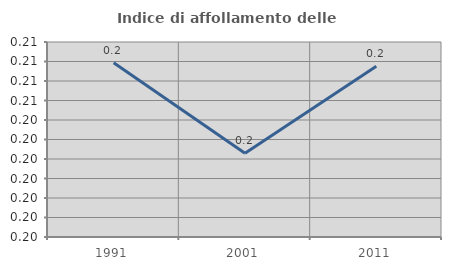
| Category | Indice di affollamento delle abitazioni  |
|---|---|
| 1991.0 | 0.207 |
| 2001.0 | 0.202 |
| 2011.0 | 0.207 |